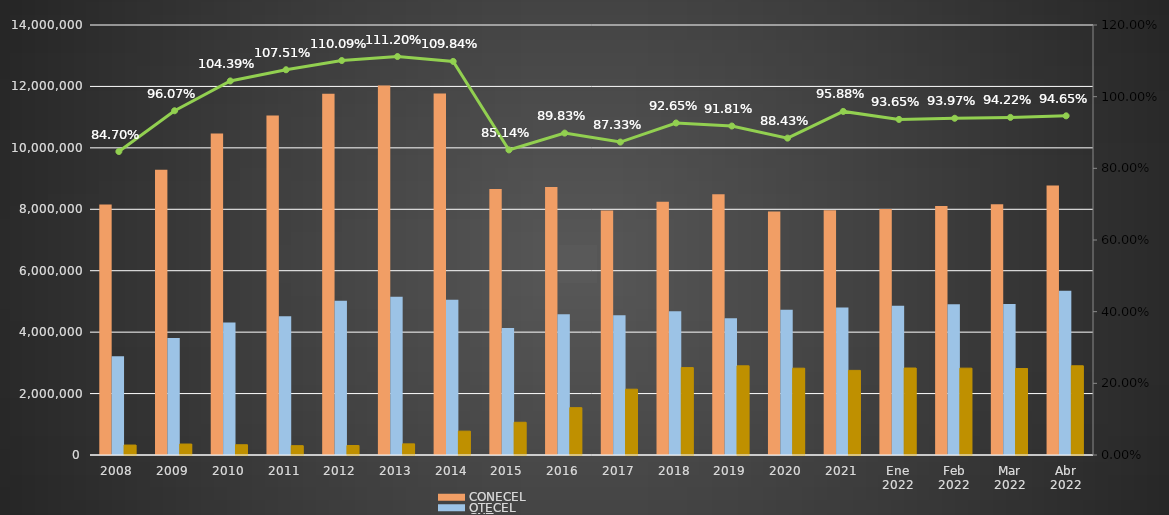
| Category | CONECEL | OTECEL | CNT |
|---|---|---|---|
| 2008 | 8156359 | 3211922 | 323967 |
| 2009 | 9291268 | 3806432 | 356900 |
| 2010 | 10470502 | 4314599 | 333730 |
| 2011 | 11057316 | 4513874 | 303368 |
| 2012 | 11757906 | 5019686 | 309271 |
| 2013 | 12030886 | 5148308 | 362560 |
| 2014 | 11772020 | 5055645 | 776892 |
| 2015 | 8658619 | 4134698 | 1065703 |
| 2016 | 8726823 | 4580092 | 1541219 |
| 2017 | 7960263 | 4549024 | 2142117 |
| 2018 | 8248050 | 4679646 | 2845142 |
| 2019 | 8493054 | 4456356 | 2903690 |
| 2020 | 7929253 | 4729725 | 2826388 |
| 2021 | 7965274 | 4800608 | 2755177 |
| Ene 2022 | 8012894 | 4856877 | 2831764 |
| Feb 2022 | 8103873 | 4909433 | 2827246 |
| Mar 2022 | 8163884 | 4915830 | 2814894 |
| Abr 2022 | 8773356 | 5349789 | 2904652 |